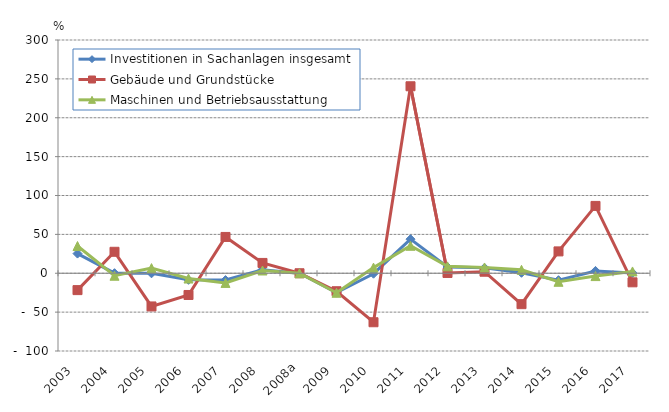
| Category | Investitionen in Sachanlagen insgesamt | Gebäude und Grundstücke | Maschinen und Betriebsausstattung |
|---|---|---|---|
| 2003  | 25.3 | -21.7 | 35 |
| 2004  | 0.1 | 27.6 | -3.2 |
| 2005  | -0.1 | -42.7 | 6.6 |
| 2006  | -8.473 | -27.938 | -6.81 |
| 2007  | -8.766 | 46.686 | -12.43 |
| 2008  | 4.511 | 13.27 | 3.542 |
| 2008a | 0 | 0 | 0 |
| 2009  | -24.896 | -23.131 | -25.113 |
| 2010  | -0.603 | -63.012 | 7.236 |
| 2011  | 43.839 | 240.486 | 35.319 |
| 2012  | 8.013 | 0.373 | 8.846 |
| 2013  | 6.929 | 1.955 | 7.43 |
| 2014  | 0.591 | -39.758 | 4.441 |
| 2015  | -8.949 | 28.111 | -10.989 |
| 2016  | 2.982 | 86.615 | -3.643 |
| 2017  | 0.457 | -11.661 | 2.316 |